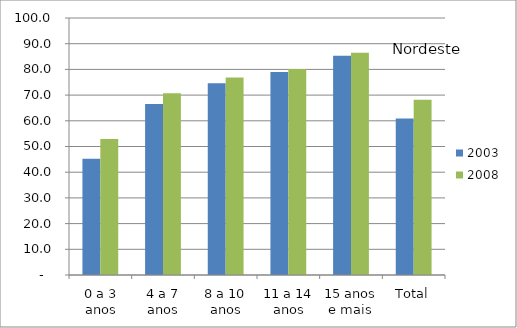
| Category | 2003 | 2008 |
|---|---|---|
| 0 a 3 anos | 45.27 | 52.89 |
| 4 a 7 anos | 66.54 | 70.74 |
| 8 a 10 anos | 74.65 | 76.87 |
| 11 a 14 anos | 79 | 80.17 |
| 15 anos e mais | 85.28 | 86.45 |
| Total | 60.88 | 68.18 |